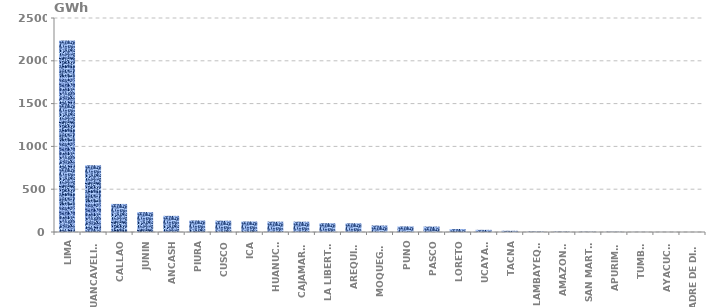
| Category | Series 0 |
|---|---|
| LIMA | 2237.624 |
| HUANCAVELICA | 781.25 |
| CALLAO | 327.908 |
| JUNIN | 232.797 |
| ANCASH | 188.573 |
| PIURA | 135.035 |
| CUSCO | 132.166 |
| ICA | 122.855 |
| HUANUCO | 121.318 |
| CAJAMARCA | 120.553 |
| LA LIBERTAD | 102.744 |
| AREQUIPA | 101.695 |
| MOQUEGUA | 75.882 |
| PUNO | 65.391 |
| PASCO | 63.518 |
| LORETO | 34.752 |
| UCAYALI | 25.361 |
| TACNA | 14.325 |
| LAMBAYEQUE | 5.226 |
| AMAZONAS | 4.364 |
| SAN MARTÍN | 3.271 |
| APURIMAC | 2.862 |
| TUMBES | 1.101 |
| AYACUCHO | 0.684 |
| MADRE DE DIOS | 0.233 |